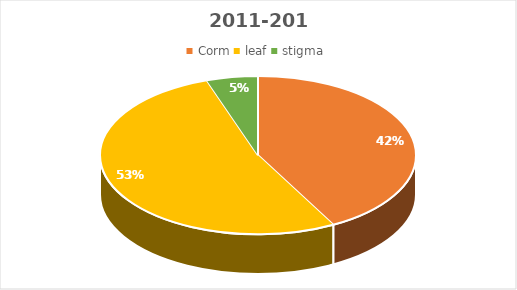
| Category | 2011-2012 |
|---|---|
| Corm | 8 |
| leaf | 10 |
| stigma | 1 |